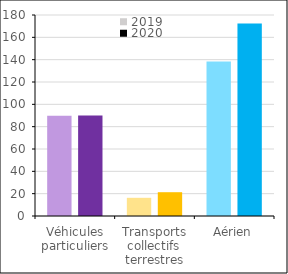
| Category | 2019 | 2020 |
|---|---|---|
| Véhicules particuliers | 89.83 | 90.083 |
| Transports collectifs terrestres | 16.285 | 21.308 |
| Aérien | 138.329 | 172.322 |